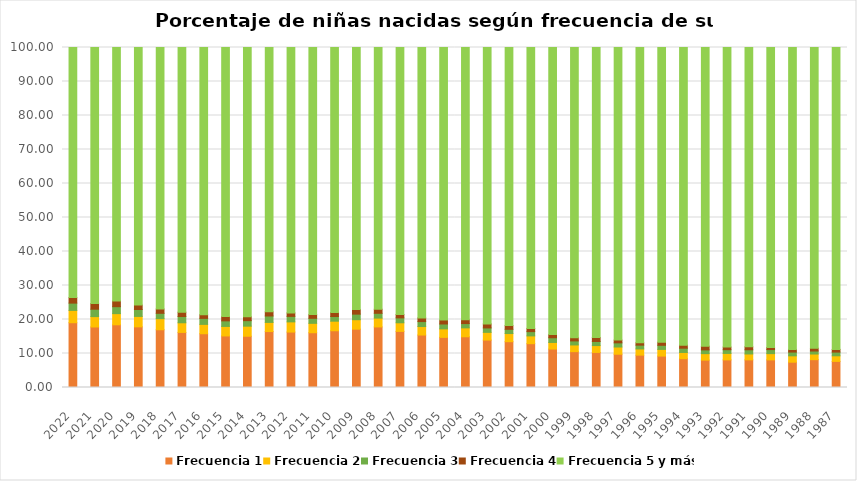
| Category | Frecuencia 1 | Frecuencia 2 | Frecuencia 3 | Frecuencia 4 | Frecuencia 5 y más |
|---|---|---|---|---|---|
| 2022.0 | 19.057 | 3.618 | 2.144 | 1.631 | 73.549 |
| 2021.0 | 17.798 | 3.056 | 2.175 | 1.667 | 75.304 |
| 2020.0 | 18.44 | 3.285 | 2.046 | 1.662 | 74.567 |
| 2019.0 | 17.841 | 3.061 | 2.045 | 1.289 | 75.763 |
| 2018.0 | 16.984 | 3.266 | 1.565 | 1.272 | 76.913 |
| 2017.0 | 16.199 | 2.837 | 1.852 | 1.262 | 77.85 |
| 2016.0 | 15.81 | 2.752 | 1.766 | 1.08 | 78.591 |
| 2015.0 | 15.16 | 2.799 | 1.64 | 1.264 | 79.137 |
| 2014.0 | 15.072 | 2.967 | 1.622 | 1.133 | 79.207 |
| 2013.0 | 16.451 | 2.693 | 1.891 | 1.209 | 77.756 |
| 2012.0 | 16.302 | 2.999 | 1.616 | 1.03 | 78.053 |
| 2011.0 | 16.108 | 2.761 | 1.484 | 1.086 | 78.561 |
| 2010.0 | 16.688 | 2.814 | 1.385 | 1.157 | 77.957 |
| 2009.0 | 17.154 | 2.785 | 1.638 | 1.333 | 77.09 |
| 2008.0 | 17.813 | 2.598 | 1.411 | 1.192 | 76.985 |
| 2007.0 | 16.501 | 2.534 | 1.446 | 1.014 | 78.506 |
| 2006.0 | 15.428 | 2.503 | 1.461 | 1.065 | 79.543 |
| 2005.0 | 14.741 | 2.505 | 1.433 | 1.155 | 80.166 |
| 2004.0 | 14.923 | 2.618 | 1.26 | 1.1 | 80.099 |
| 2003.0 | 13.951 | 2.266 | 1.302 | 1.182 | 81.298 |
| 2002.0 | 13.472 | 2.396 | 1.247 | 1.1 | 81.786 |
| 2001.0 | 12.893 | 2.282 | 1.262 | 0.938 | 82.626 |
| 2000.0 | 11.311 | 1.936 | 1.386 | 0.939 | 84.428 |
| 1999.0 | 10.541 | 1.974 | 1.187 | 0.927 | 85.371 |
| 1998.0 | 10.313 | 2.017 | 1.208 | 1.169 | 85.293 |
| 1997.0 | 9.788 | 2.12 | 1.221 | 0.814 | 86.057 |
| 1996.0 | 9.517 | 1.827 | 1.112 | 0.689 | 86.855 |
| 1995.0 | 9.242 | 1.96 | 1.205 | 0.918 | 86.676 |
| 1994.0 | 8.471 | 1.836 | 1.252 | 0.896 | 87.546 |
| 1993.0 | 8.048 | 1.915 | 1.098 | 1.09 | 87.85 |
| 1992.0 | 8.12 | 1.901 | 1.096 | 0.78 | 88.103 |
| 1991.0 | 8.128 | 1.739 | 1.228 | 0.869 | 88.036 |
| 1990.0 | 8.122 | 1.838 | 1.189 | 0.624 | 88.228 |
| 1989.0 | 7.442 | 1.871 | 1.105 | 0.778 | 88.804 |
| 1988.0 | 8.181 | 1.666 | 0.882 | 0.817 | 88.454 |
| 1987.0 | 7.675 | 1.645 | 1.091 | 0.791 | 88.798 |